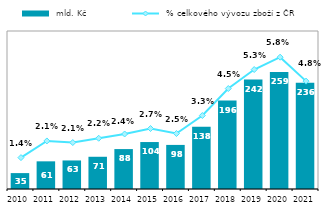
| Category |  mld. Kč |
|---|---|
| 2010.0 | 35.22 |
| 2011.0 | 61.281 |
| 2012.0 | 63.24 |
| 2013.0 | 71.383 |
| 2014.0 | 88.432 |
| 2015.0 | 104.021 |
| 2016.0 | 97.651 |
| 2017.0 | 138.167 |
| 2018.0 | 196.02 |
| 2019.0 | 242.408 |
| 2020.0 | 259.421 |
| 2021.0 | 235.585 |